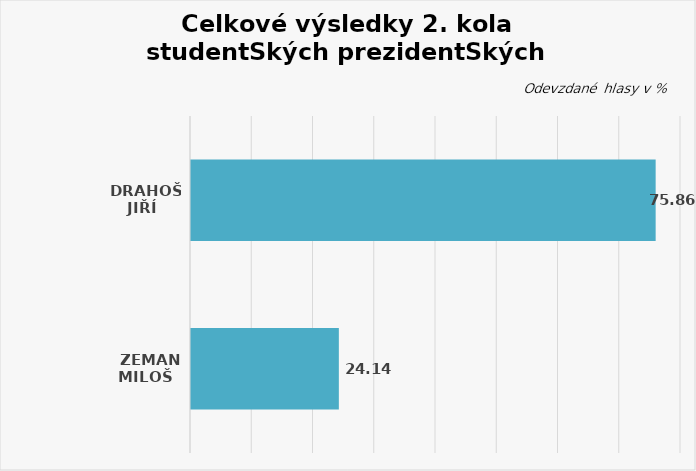
| Category | Series 0 |
|---|---|
| Drahoš Jiří   | 75.862 |
| Zeman Miloš   | 24.138 |